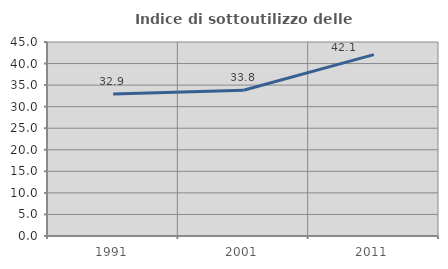
| Category | Indice di sottoutilizzo delle abitazioni  |
|---|---|
| 1991.0 | 32.932 |
| 2001.0 | 33.818 |
| 2011.0 | 42.077 |